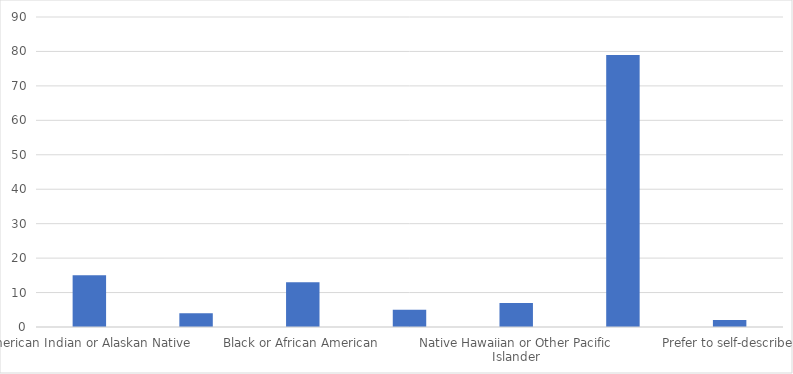
| Category | Number of Responses |
|---|---|
| American Indian or Alaskan Native | 15 |
| Asian | 4 |
| Black or African American | 13 |
| Hispanic or Latino/a/x | 5 |
| Native Hawaiian or Other Pacific Islander | 7 |
| White | 79 |
| Prefer to self-describe | 2 |